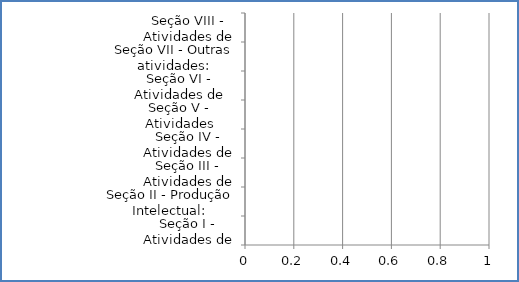
| Category | Series 0 |
|---|---|
| Seção I - Atividades de Ensino: | 0 |
| Seção II - Produção Intelectual: | 0 |
| Seção III - Atividades de pesquisa: | 0 |
| Seção IV - Atividades de extensão: | 0 |
| Seção V - Atividades administrativas: | 0 |
| Seção VI - Atividades de respresentação: | 0 |
| Seção VII - Outras atividades: | 0 |
| Seção VIII - Atividades de qualificação: | 0 |